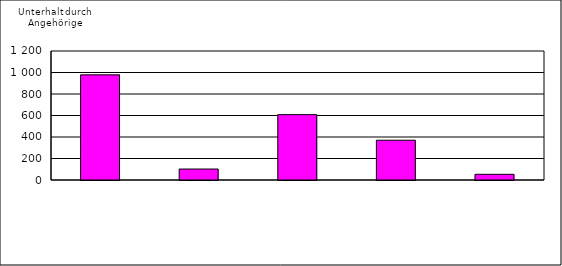
| Category | Series 0 |
|---|---|
| 0 | 978 |
| 1 | 102 |
| 2 | 608 |
| 3 | 370 |
| 4 | 53 |